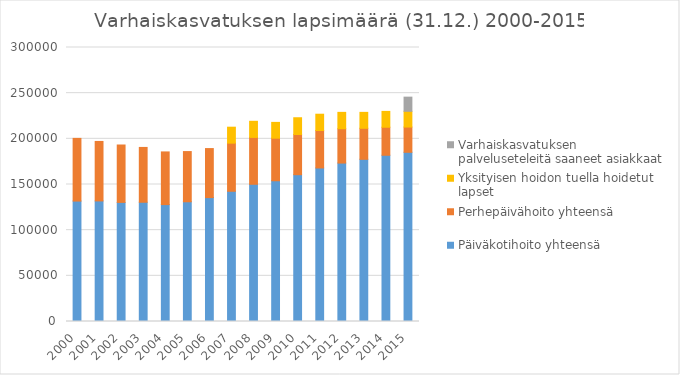
| Category | Päiväkotihoito yhteensä | Perhepäivähoito yhteensä | Yksityisen hoidon tuella hoidetut lapset | Varhaiskasvatuksen palveluseteleitä saaneet asiakkaat |
|---|---|---|---|---|
| 2000 | 131857 | 68630 | 0 | 0 |
| 2001 | 132011 | 65125 | 0 | 0 |
| 2002 | 130413 | 62837 | 0 | 0 |
| 2003 | 130564 | 60021 | 0 | 0 |
| 2004 | 128011 | 57658 | 0 | 0 |
| 2005 | 131078 | 54975 | 0 | 0 |
| 2006 | 135652 | 53680 | 0 | 0 |
| 2007 | 142584 | 52681 | 17480 | 0 |
| 2008 | 150239 | 51311 | 17648 | 0 |
| 2009 | 154090 | 46637 | 17278 | 0 |
| 2010 | 160735 | 44012 | 18341 | 0 |
| 2011 | 168110 | 40988 | 17860 | 0 |
| 2012 | 173460 | 37603 | 17918 | 0 |
| 2013 | 177577 | 33964 | 17440 | 0 |
| 2014 | 182018 | 30672 | 17348 | 0 |
| 2015 | 185273 | 27629 | 17234 | 15514 |